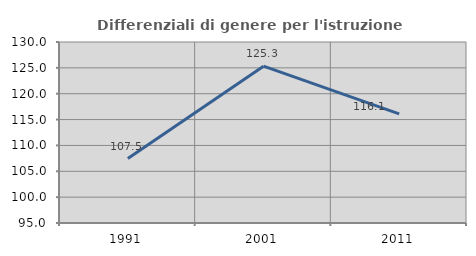
| Category | Differenziali di genere per l'istruzione superiore |
|---|---|
| 1991.0 | 107.451 |
| 2001.0 | 125.332 |
| 2011.0 | 116.107 |